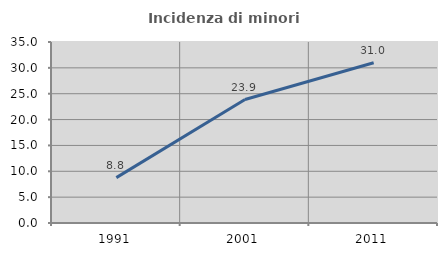
| Category | Incidenza di minori stranieri |
|---|---|
| 1991.0 | 8.772 |
| 2001.0 | 23.871 |
| 2011.0 | 30.98 |